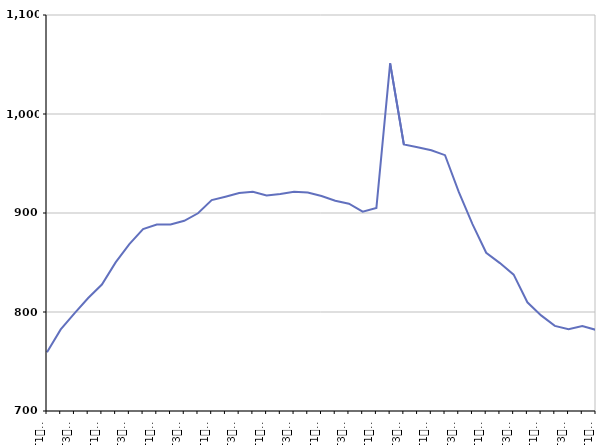
| Category | 50 ans ou plus |
|---|---|
| T1
2014 | 759.3 |
| T2
2014 | 782.4 |
| T3
2014 | 798.7 |
| T4
2014 | 814.1 |
| T1
2015 | 827.7 |
| T2
2015 | 850.1 |
| T3
2015 | 868.5 |
| T4
2015 | 883.7 |
| T1
2016 | 888.3 |
| T2
2016 | 888.3 |
| T3
2016 | 892.1 |
| T4
2016 | 899.7 |
| T1
2017 | 913 |
| T2
2017 | 916.4 |
| T3
2017 | 920.1 |
| T4
2017 | 921.5 |
| T1
2018 | 917.8 |
| T2
2018 | 919.1 |
| T3
2018 | 921.4 |
| T4
2018 | 920.7 |
| T1
2019 | 917.1 |
| T2
2019 | 912.4 |
| T3
2019 | 909.4 |
| T4
2019 | 901.3 |
| T1
2020 | 905.1 |
| T2
2020 | 1051.2 |
| T3
2020 | 969.2 |
| T4
2020 | 966.4 |
| T1
2021 | 963.4 |
| T2
2021 | 958.4 |
| T3
2021 | 921.3 |
| T4
2021 | 888.8 |
| T1
2022 | 859.8 |
| T2
2022 | 849.4 |
| T3
2022 | 837.7 |
| T4
2022 | 809.8 |
| T1
2023 | 796.6 |
| T2
2023 | 786 |
| T3
2023 | 782.7 |
| T4
2023 | 785.9 |
| T1
2024 | 781.9 |